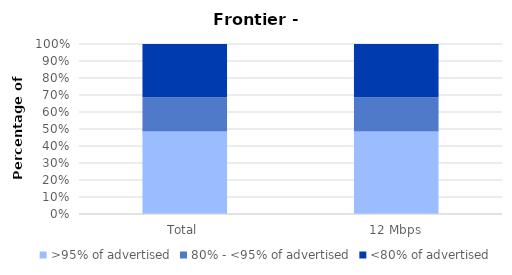
| Category | >95% of advertised | 80% - <95% of advertised | <80% of advertised |
|---|---|---|---|
| Total | 0.493 | 0.194 | 0.313 |
| 12 Mbps | 0.493 | 0.194 | 0.313 |